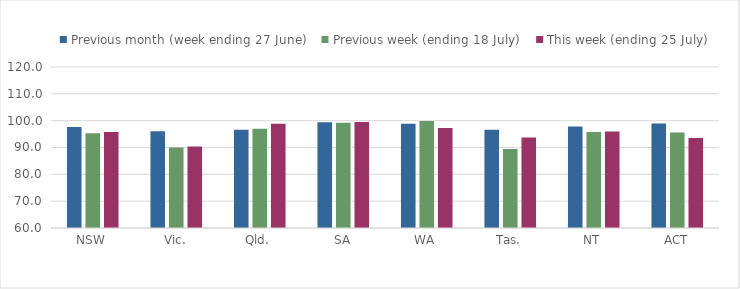
| Category | Previous month (week ending 27 June) | Previous week (ending 18 July) | This week (ending 25 July) |
|---|---|---|---|
| NSW | 97.656 | 95.357 | 95.798 |
| Vic. | 96.047 | 89.978 | 90.347 |
| Qld. | 96.608 | 97.005 | 98.847 |
| SA | 99.371 | 99.264 | 99.505 |
| WA | 98.828 | 99.885 | 97.303 |
| Tas. | 96.58 | 89.449 | 93.718 |
| NT | 97.871 | 95.813 | 95.919 |
| ACT | 98.906 | 95.59 | 93.562 |